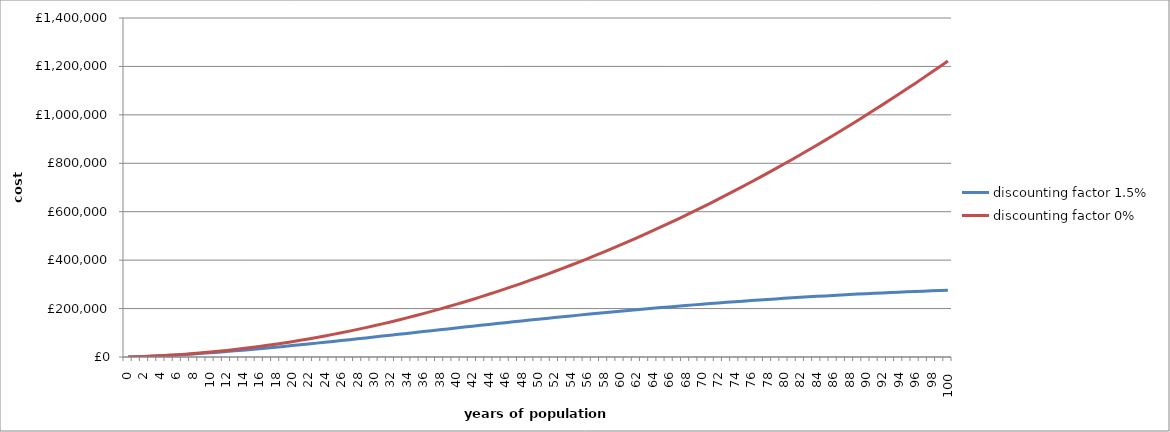
| Category | discounting factor 1.5% | discounting factor 0% |
|---|---|---|
| 0.0 | 0 | 0 |
| 1.0 | 1003.558 | 1018.612 |
| 2.0 | 2197.172 | 2263.581 |
| 3.0 | 3571.757 | 3734.909 |
| 4.0 | 5118.506 | 5432.596 |
| 5.0 | 6828.877 | 7356.64 |
| 6.0 | 8694.591 | 9507.042 |
| 7.0 | 10707.625 | 11883.803 |
| 8.0 | 12860.201 | 14486.922 |
| 9.0 | 15144.788 | 17316.398 |
| 10.0 | 17554.086 | 20372.233 |
| 11.0 | 20081.029 | 23654.427 |
| 12.0 | 22718.773 | 27162.978 |
| 13.0 | 25460.694 | 30897.887 |
| 14.0 | 28300.38 | 34859.155 |
| 15.0 | 31231.626 | 39046.781 |
| 16.0 | 34248.431 | 43460.765 |
| 17.0 | 37344.99 | 48101.107 |
| 18.0 | 40515.689 | 52967.807 |
| 19.0 | 43755.102 | 58060.865 |
| 20.0 | 47057.984 | 63380.282 |
| 21.0 | 50419.269 | 68926.056 |
| 22.0 | 53834.061 | 74698.189 |
| 23.0 | 57297.635 | 80696.68 |
| 24.0 | 60805.427 | 86921.529 |
| 25.0 | 64353.034 | 93372.736 |
| 26.0 | 67936.208 | 100050.302 |
| 27.0 | 71550.851 | 106954.225 |
| 28.0 | 75193.013 | 114084.507 |
| 29.0 | 78858.885 | 121441.147 |
| 30.0 | 82544.8 | 129024.145 |
| 31.0 | 86247.225 | 136833.501 |
| 32.0 | 89962.757 | 144869.215 |
| 33.0 | 93688.123 | 153131.288 |
| 34.0 | 97420.176 | 161619.718 |
| 35.0 | 101155.886 | 170334.507 |
| 36.0 | 104892.345 | 179275.654 |
| 37.0 | 108626.757 | 188443.159 |
| 38.0 | 112356.438 | 197837.022 |
| 39.0 | 116078.812 | 207457.243 |
| 40.0 | 119791.41 | 217303.823 |
| 41.0 | 123491.863 | 227376.761 |
| 42.0 | 127177.903 | 237676.056 |
| 43.0 | 130847.356 | 248201.71 |
| 44.0 | 134498.146 | 258953.722 |
| 45.0 | 138128.285 | 269932.093 |
| 46.0 | 141735.874 | 281136.821 |
| 47.0 | 145319.1 | 292567.907 |
| 48.0 | 148876.234 | 304225.352 |
| 49.0 | 152405.628 | 316109.155 |
| 50.0 | 155905.711 | 328219.316 |
| 51.0 | 159374.99 | 340555.835 |
| 52.0 | 162812.046 | 353118.712 |
| 53.0 | 166215.532 | 365907.948 |
| 54.0 | 169584.168 | 378923.541 |
| 55.0 | 172916.746 | 392165.493 |
| 56.0 | 176212.119 | 405633.803 |
| 57.0 | 179469.206 | 419328.471 |
| 58.0 | 182686.988 | 433249.497 |
| 59.0 | 185864.505 | 447396.881 |
| 60.0 | 189000.854 | 461770.624 |
| 61.0 | 192095.188 | 476370.724 |
| 62.0 | 195146.716 | 491197.183 |
| 63.0 | 198154.699 | 506250 |
| 64.0 | 201118.446 | 521529.175 |
| 65.0 | 204037.319 | 537034.708 |
| 66.0 | 206910.726 | 552766.6 |
| 67.0 | 209738.121 | 568724.849 |
| 68.0 | 212519.003 | 584909.457 |
| 69.0 | 215252.914 | 601320.423 |
| 70.0 | 217939.436 | 617957.746 |
| 71.0 | 220578.195 | 634821.429 |
| 72.0 | 223168.852 | 651911.469 |
| 73.0 | 225711.108 | 669227.867 |
| 74.0 | 228204.699 | 686770.624 |
| 75.0 | 230649.398 | 704539.738 |
| 76.0 | 233045.009 | 722535.211 |
| 77.0 | 235391.37 | 740757.042 |
| 78.0 | 237688.35 | 759205.231 |
| 79.0 | 239935.851 | 777879.779 |
| 80.0 | 242133.8 | 796780.684 |
| 81.0 | 244282.154 | 815907.948 |
| 82.0 | 246380.899 | 835261.569 |
| 83.0 | 248430.044 | 854841.549 |
| 84.0 | 250429.625 | 874647.887 |
| 85.0 | 252379.701 | 894680.584 |
| 86.0 | 254280.355 | 914939.638 |
| 87.0 | 256131.693 | 935425.05 |
| 88.0 | 257933.841 | 956136.821 |
| 89.0 | 259686.946 | 977074.95 |
| 90.0 | 261391.175 | 998239.437 |
| 91.0 | 263046.714 | 1019630.282 |
| 92.0 | 264653.766 | 1041247.485 |
| 93.0 | 266212.554 | 1063091.046 |
| 94.0 | 267723.314 | 1085160.966 |
| 95.0 | 269186.301 | 1107457.243 |
| 96.0 | 270601.783 | 1129979.879 |
| 97.0 | 271970.045 | 1152728.873 |
| 98.0 | 273291.383 | 1175704.225 |
| 99.0 | 274566.108 | 1198905.936 |
| 100.0 | 275794.543 | 1222334.004 |